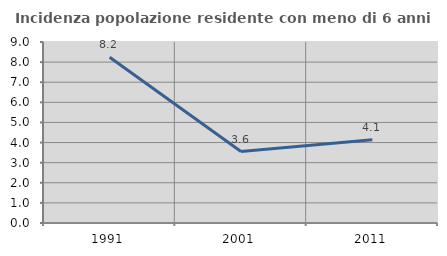
| Category | Incidenza popolazione residente con meno di 6 anni |
|---|---|
| 1991.0 | 8.242 |
| 2001.0 | 3.553 |
| 2011.0 | 4.145 |